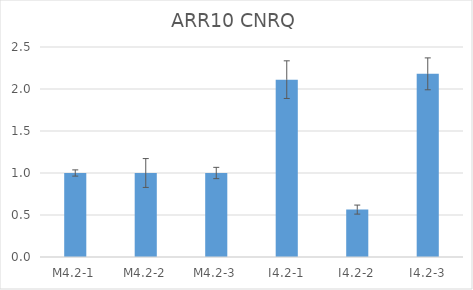
| Category | ARR10 CNRQ |
|---|---|
| M4.2-1 | 1 |
| M4.2-2 | 1 |
| M4.2-3 | 1 |
| I4.2-1 | 2.111 |
| I4.2-2 | 0.564 |
| I4.2-3 | 2.18 |